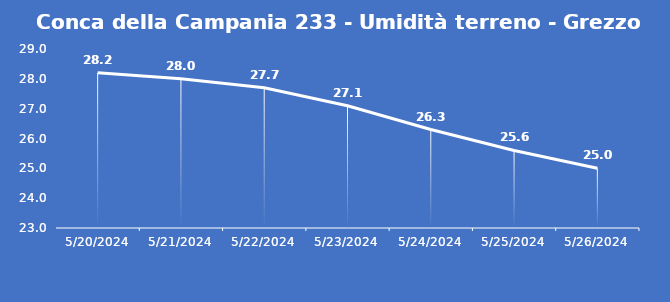
| Category | Conca della Campania 233 - Umidità terreno - Grezzo (%VWC) |
|---|---|
| 5/20/24 | 28.2 |
| 5/21/24 | 28 |
| 5/22/24 | 27.7 |
| 5/23/24 | 27.1 |
| 5/24/24 | 26.3 |
| 5/25/24 | 25.6 |
| 5/26/24 | 25 |